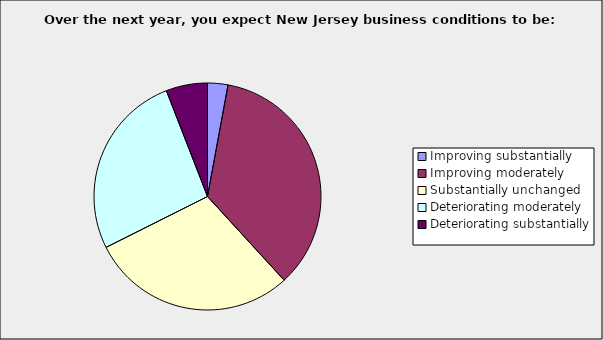
| Category | Series 0 |
|---|---|
| Improving substantially | 0.029 |
| Improving moderately | 0.353 |
| Substantially unchanged | 0.294 |
| Deteriorating moderately | 0.265 |
| Deteriorating substantially | 0.059 |